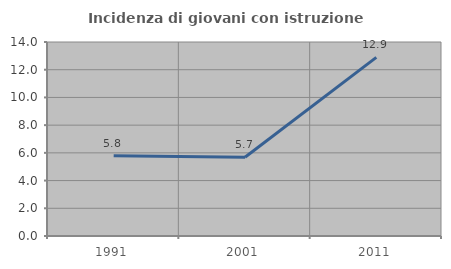
| Category | Incidenza di giovani con istruzione universitaria |
|---|---|
| 1991.0 | 5.782 |
| 2001.0 | 5.678 |
| 2011.0 | 12.891 |